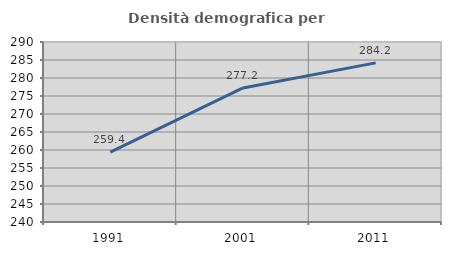
| Category | Densità demografica |
|---|---|
| 1991.0 | 259.383 |
| 2001.0 | 277.25 |
| 2011.0 | 284.205 |